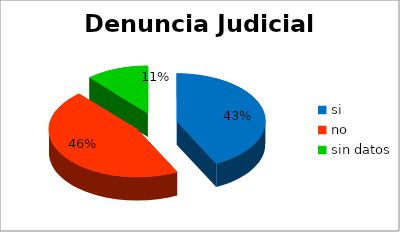
| Category | 2011 |
|---|---|
| si | 52 |
| no | 56 |
| sin datos | 14 |